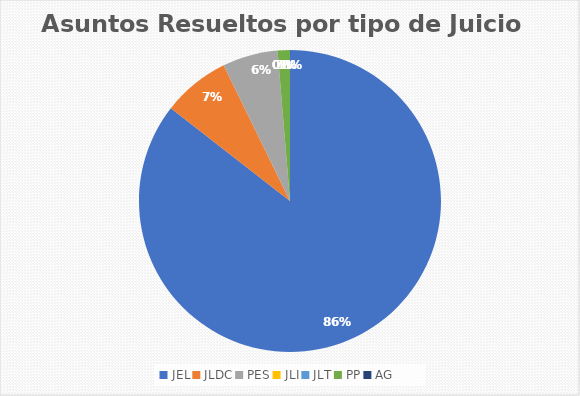
| Category | Asuntos Resueltos por tipo de Juicio  Julio |
|---|---|
| JEL | 130 |
| JLDC | 11 |
| PES | 9 |
| JLI | 0 |
| JLT | 0 |
| PP | 2 |
| AG | 0 |